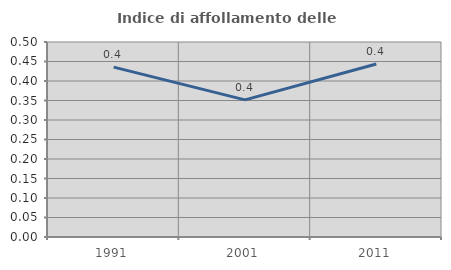
| Category | Indice di affollamento delle abitazioni  |
|---|---|
| 1991.0 | 0.436 |
| 2001.0 | 0.351 |
| 2011.0 | 0.444 |